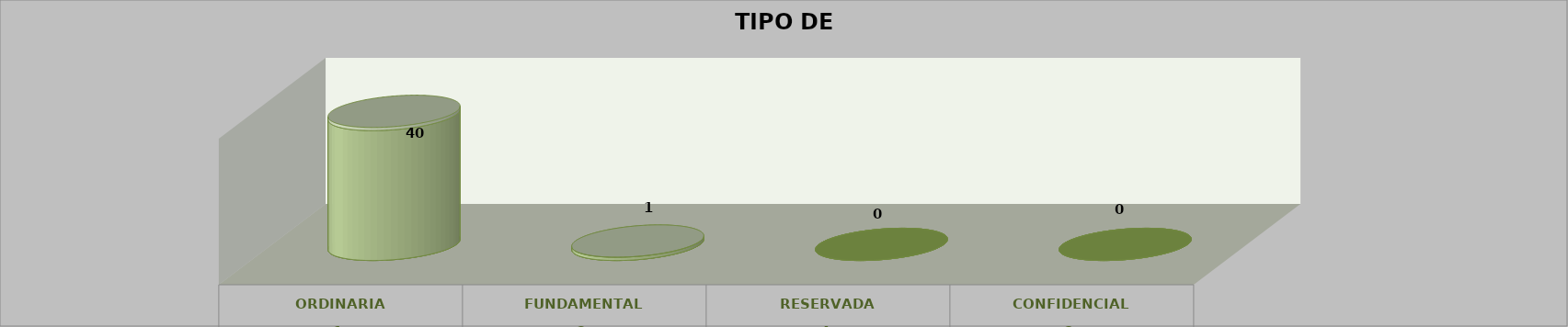
| Category | Series 0 | Series 2 | Series 1 | Series 3 | Series 4 |
|---|---|---|---|---|---|
| 0 |  |  |  | 40 | 0.976 |
| 1 |  |  |  | 1 | 0.024 |
| 2 |  |  |  | 0 | 0 |
| 3 |  |  |  | 0 | 0 |